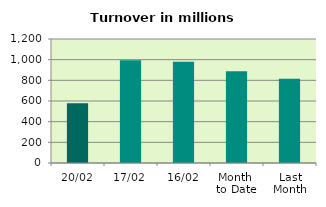
| Category | Series 0 |
|---|---|
| 20/02 | 577.532 |
| 17/02 | 993.38 |
| 16/02 | 980.693 |
| Month 
to Date | 887.99 |
| Last
Month | 814.821 |